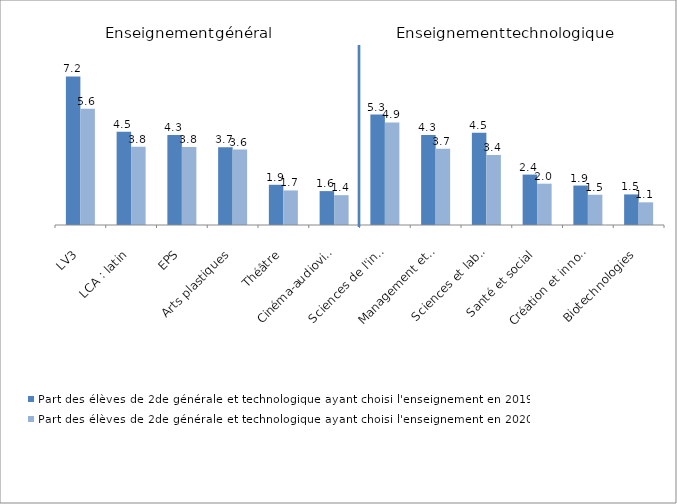
| Category | Part des élèves de 2de générale et technologique ayant choisi l'enseignement en 2019 | Part des élèves de 2de générale et technologique ayant choisi l'enseignement en 2020 |
|---|---|---|
| LV3 | 7.158 | 5.604 |
| LCA : latin | 4.494 | 3.767 |
| EPS | 4.339 | 3.754 |
| Arts plastiques | 3.747 | 3.638 |
| Théâtre | 1.938 | 1.666 |
| Cinéma-audiovisuel | 1.634 | 1.437 |
| Sciences de l'ingénieur | 5.324 | 4.941 |
| Management et gestion | 4.332 | 3.676 |
| Sciences et laboratoire | 4.451 | 3.372 |
| Santé et social | 2.429 | 1.991 |
| Création et innovation technologiques | 1.902 | 1.458 |
| Biotechnologies | 1.474 | 1.093 |